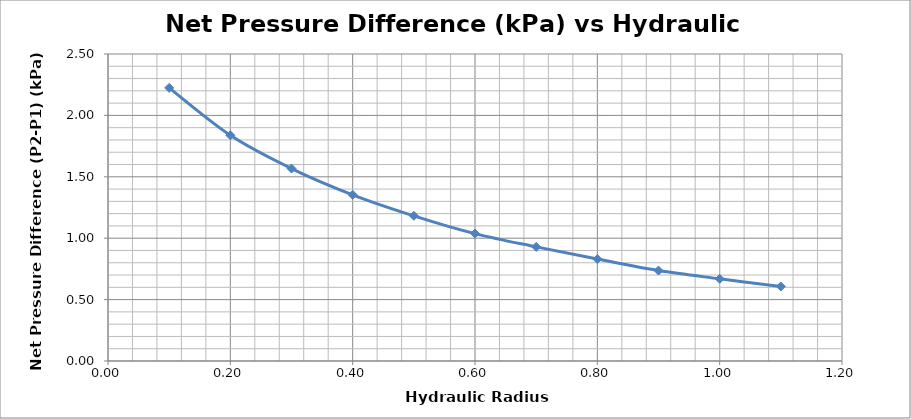
| Category | Net Pressure Difference (kPa) |
|---|---|
| 0.1 | 2.224 |
| 0.2 | 1.838 |
| 0.3 | 1.567 |
| 0.4 | 1.353 |
| 0.5 | 1.182 |
| 0.6 | 1.037 |
| 0.7 | 0.929 |
| 0.8 | 0.83 |
| 0.9 | 0.736 |
| 1.0 | 0.669 |
| 1.1 | 0.607 |